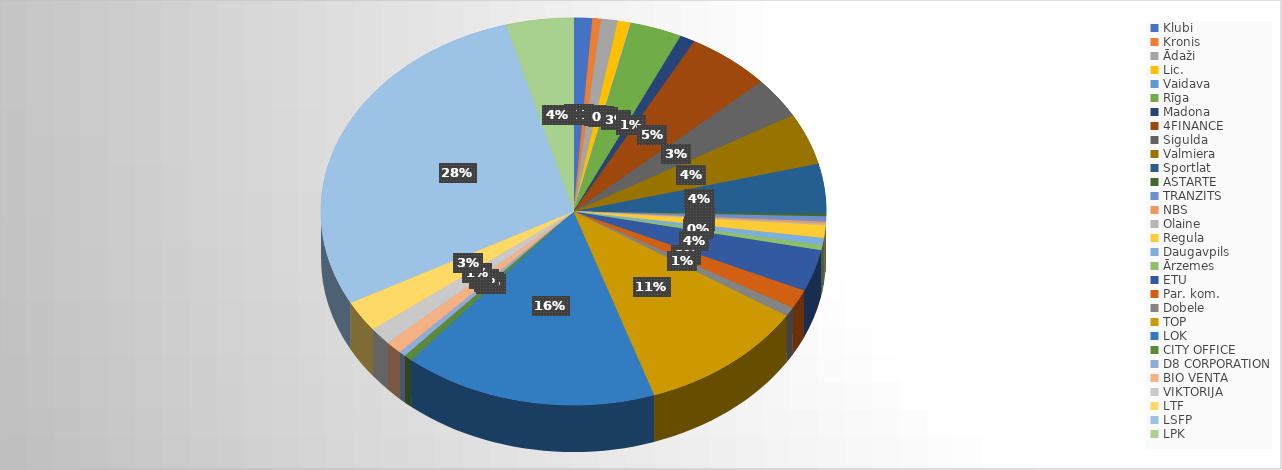
| Category | Series 0 | Series 1 |
|---|---|---|
| Klubi | 1100 |  |
| Kronis | 500 |  |
| Ādaži | 1000 |  |
| Lic. | 780 |  |
| Vaidava | 61.2 |  |
| Rīga | 3015 |  |
| Madona | 900 |  |
| 4FINANCE | 5000 |  |
| Sigulda | 3144 |  |
| Valmiera | 4018 |  |
| Sportlat | 3828.5 |  |
| ASTARTE | 200 |  |
| TRANZITS | 400 |  |
| NBS | 165 |  |
| Olaine | 108 |  |
| Regula | 1000 |  |
| Daugavpils | 541 |  |
| Ārzemes | 400 |  |
| ETU | 3250 |  |
| Par. kom. | 1476 |  |
| Dobele | 700 |  |
| TOP | 10000 |  |
| LOK | 15069.87 |  |
| CITY OFFICE | 500 |  |
| D8 CORPORATION | 400 |  |
| BIO VENTA | 1000 |  |
| VIKTORIJA | 1344 |  |
| LTF | 2422.55 |  |
| LSFP | 26434 |  |
| LPK | 4000 |  |